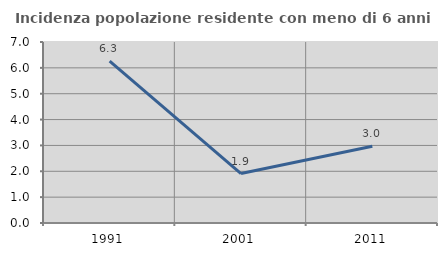
| Category | Incidenza popolazione residente con meno di 6 anni |
|---|---|
| 1991.0 | 6.263 |
| 2001.0 | 1.911 |
| 2011.0 | 2.966 |